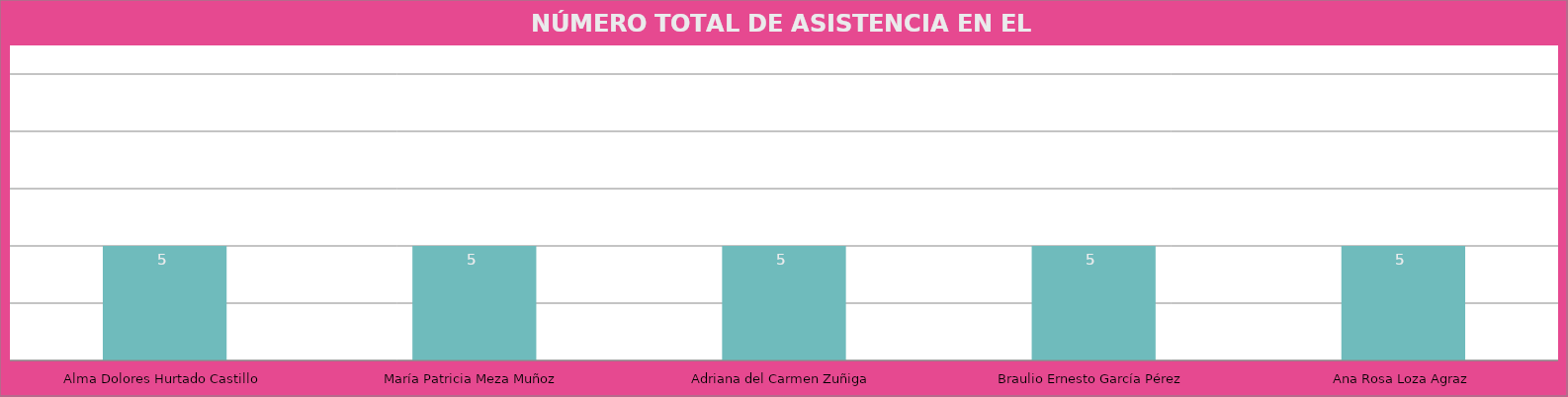
| Category | Alma Dolores Hurtado Castillo |
|---|---|
| Alma Dolores Hurtado Castillo | 5 |
| María Patricia Meza Muñoz | 5 |
| Adriana del Carmen Zuñiga | 5 |
| Braulio Ernesto García Pérez | 5 |
| Ana Rosa Loza Agraz | 5 |